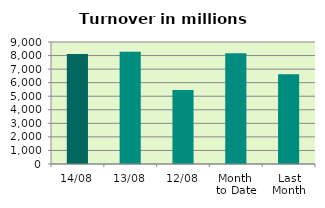
| Category | Series 0 |
|---|---|
| 14/08 | 8106.749 |
| 13/08 | 8282.703 |
| 12/08 | 5461.064 |
| Month 
to Date | 8164.713 |
| Last
Month | 6625.077 |